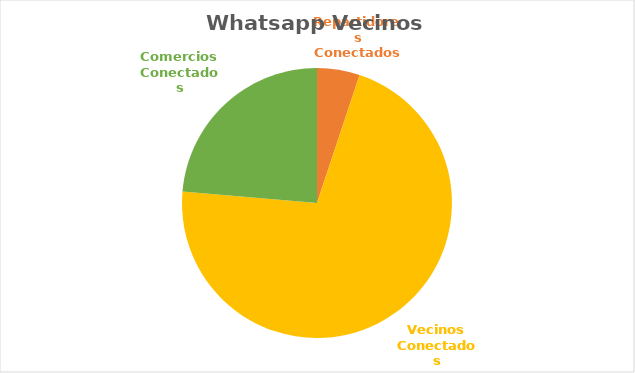
| Category | Series 0 | Series 1 |
|---|---|---|
| Repartidores Conectados | 32 | 0.051 |
| Vecinos Conectados | 446 | 0.712 |
| Comercios Conectados | 148 | 0.236 |